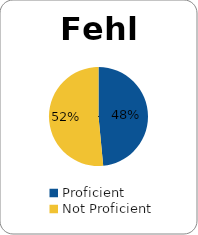
| Category | Series 0 |
|---|---|
| Proficient | 0.485 |
| Not Proficient | 0.515 |